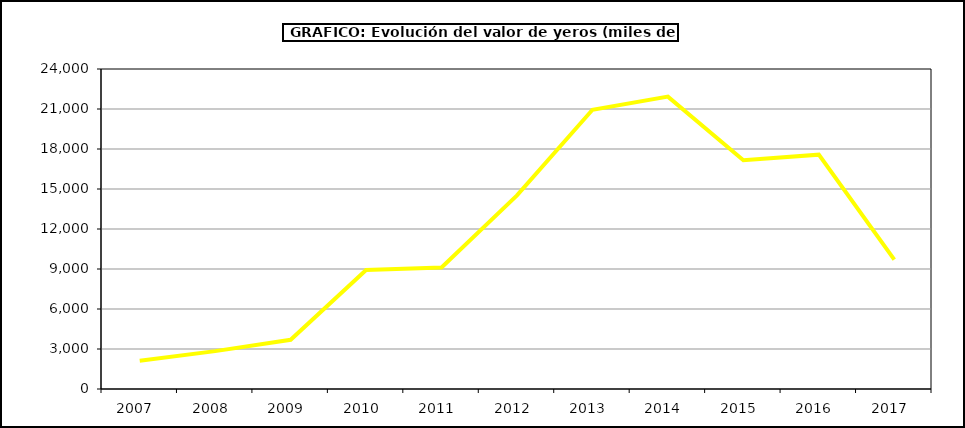
| Category | Valor |
|---|---|
| 2007.0 | 2125.671 |
| 2008.0 | 2839.518 |
| 2009.0 | 3689.373 |
| 2010.0 | 8923.742 |
| 2011.0 | 9108.203 |
| 2012.0 | 14519.486 |
| 2013.0 | 20944.865 |
| 2014.0 | 21928.601 |
| 2015.0 | 17159 |
| 2016.0 | 17573 |
| 2017.0 | 9700.839 |